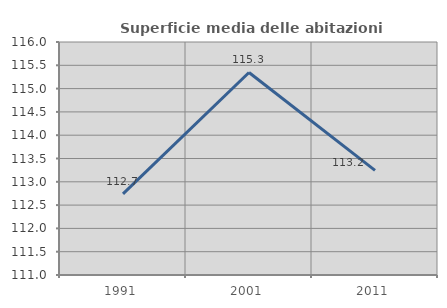
| Category | Superficie media delle abitazioni occupate |
|---|---|
| 1991.0 | 112.741 |
| 2001.0 | 115.346 |
| 2011.0 | 113.245 |